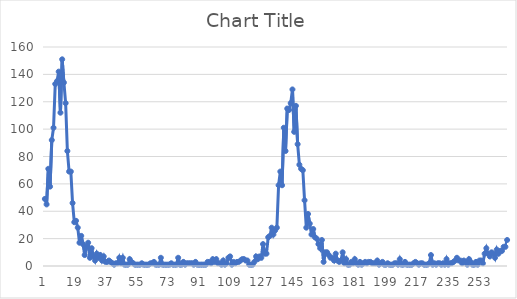
| Category | Series 0 |
|---|---|
| 0 | 49 |
| 1 | 45 |
| 2 | 71 |
| 3 | 58 |
| 4 | 92 |
| 5 | 101 |
| 6 | 133 |
| 7 | 135 |
| 8 | 142 |
| 9 | 112 |
| 10 | 151 |
| 11 | 134 |
| 12 | 119 |
| 13 | 84 |
| 14 | 69 |
| 15 | 69 |
| 16 | 46 |
| 17 | 32 |
| 18 | 33 |
| 19 | 28 |
| 20 | 17 |
| 21 | 22 |
| 22 | 16 |
| 23 | 8 |
| 24 | 14 |
| 25 | 17 |
| 26 | 6 |
| 27 | 13 |
| 28 | 7 |
| 29 | 4 |
| 30 | 9 |
| 31 | 6 |
| 32 | 8 |
| 33 | 4 |
| 34 | 7 |
| 35 | 3 |
| 36 | 3 |
| 37 | 4 |
| 38 | 3 |
| 39 | 2 |
| 40 | 1 |
| 41 | 2 |
| 42 | 2 |
| 43 | 6 |
| 44 | 2 |
| 45 | 6 |
| 46 | 1 |
| 47 | 1 |
| 48 | 1 |
| 49 | 5 |
| 50 | 3 |
| 51 | 2 |
| 52 | 1 |
| 53 | 1 |
| 54 | 1 |
| 55 | 1 |
| 56 | 2 |
| 57 | 1 |
| 58 | 1 |
| 59 | 1 |
| 60 | 1 |
| 61 | 2 |
| 62 | 2 |
| 63 | 3 |
| 64 | 1 |
| 65 | 1 |
| 66 | 1 |
| 67 | 6 |
| 68 | 1 |
| 69 | 1 |
| 70 | 1 |
| 71 | 1 |
| 72 | 1 |
| 73 | 2 |
| 74 | 1 |
| 75 | 1 |
| 76 | 1 |
| 77 | 6 |
| 78 | 1 |
| 79 | 1 |
| 80 | 3 |
| 81 | 1 |
| 82 | 2 |
| 83 | 2 |
| 84 | 2 |
| 85 | 2 |
| 86 | 1 |
| 87 | 3 |
| 88 | 1 |
| 89 | 1 |
| 90 | 1 |
| 91 | 1 |
| 92 | 1 |
| 93 | 1 |
| 94 | 3 |
| 95 | 3 |
| 96 | 2 |
| 97 | 5 |
| 98 | 3 |
| 99 | 5 |
| 100 | 2 |
| 101 | 2 |
| 102 | 1 |
| 103 | 4 |
| 104 | 1 |
| 105 | 2 |
| 106 | 6 |
| 107 | 7 |
| 108 | 1 |
| 109 | 3 |
| 110 | 2 |
| 111 | 3 |
| 112 | 3 |
| 113 | 4 |
| 114 | 5 |
| 115 | 5 |
| 116 | 4 |
| 117 | 4 |
| 118 | 1 |
| 119 | 1 |
| 120 | 1 |
| 121 | 3 |
| 122 | 7 |
| 123 | 5 |
| 124 | 7 |
| 125 | 6 |
| 126 | 16 |
| 127 | 9 |
| 128 | 9 |
| 129 | 21 |
| 130 | 22 |
| 131 | 28 |
| 132 | 23 |
| 133 | 26 |
| 134 | 28 |
| 135 | 59 |
| 136 | 69 |
| 137 | 59 |
| 138 | 101 |
| 139 | 84 |
| 140 | 115 |
| 141 | 114 |
| 142 | 119 |
| 143 | 129 |
| 144 | 98 |
| 145 | 117 |
| 146 | 89 |
| 147 | 74 |
| 148 | 71 |
| 149 | 70 |
| 150 | 48 |
| 151 | 28 |
| 152 | 38 |
| 153 | 31 |
| 154 | 23 |
| 155 | 27 |
| 156 | 21 |
| 157 | 20 |
| 158 | 16 |
| 159 | 13 |
| 160 | 19 |
| 161 | 3 |
| 162 | 10 |
| 163 | 10 |
| 164 | 8 |
| 165 | 6 |
| 166 | 6 |
| 167 | 4 |
| 168 | 9 |
| 169 | 4 |
| 170 | 3 |
| 171 | 4 |
| 172 | 10 |
| 173 | 2 |
| 174 | 5 |
| 175 | 1 |
| 176 | 1 |
| 177 | 3 |
| 178 | 2 |
| 179 | 5 |
| 180 | 2 |
| 181 | 1 |
| 182 | 3 |
| 183 | 1 |
| 184 | 2 |
| 185 | 3 |
| 186 | 2 |
| 187 | 3 |
| 188 | 3 |
| 189 | 2 |
| 190 | 2 |
| 191 | 2 |
| 192 | 4 |
| 193 | 1 |
| 194 | 2 |
| 195 | 3 |
| 196 | 1 |
| 197 | 1 |
| 198 | 2 |
| 199 | 1 |
| 200 | 1 |
| 201 | 1 |
| 202 | 2 |
| 203 | 2 |
| 204 | 1 |
| 205 | 5 |
| 206 | 1 |
| 207 | 1 |
| 208 | 3 |
| 209 | 1 |
| 210 | 1 |
| 211 | 1 |
| 212 | 1 |
| 213 | 2 |
| 214 | 3 |
| 215 | 2 |
| 216 | 1 |
| 217 | 2 |
| 218 | 2 |
| 219 | 1 |
| 220 | 1 |
| 221 | 1 |
| 222 | 2 |
| 223 | 8 |
| 224 | 1 |
| 225 | 2 |
| 226 | 1 |
| 227 | 2 |
| 228 | 2 |
| 229 | 1 |
| 230 | 2 |
| 231 | 1 |
| 232 | 5 |
| 233 | 1 |
| 234 | 2 |
| 235 | 2 |
| 236 | 3 |
| 237 | 4 |
| 238 | 6 |
| 239 | 4 |
| 240 | 4 |
| 241 | 2 |
| 242 | 4 |
| 243 | 3 |
| 244 | 1 |
| 245 | 5 |
| 246 | 3 |
| 247 | 1 |
| 248 | 1 |
| 249 | 3 |
| 250 | 1 |
| 251 | 4 |
| 252 | 4 |
| 253 | 2 |
| 254 | 9 |
| 255 | 13 |
| 256 | 9 |
| 257 | 7 |
| 258 | 10 |
| 259 | 9 |
| 260 | 6 |
| 261 | 12 |
| 262 | 9 |
| 263 | 11 |
| 264 | 11 |
| 265 | 14 |
| 266 | 14 |
| 267 | 19 |